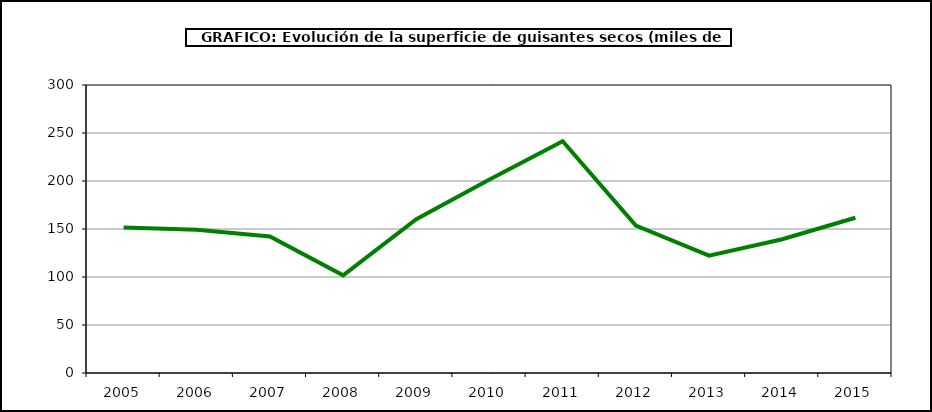
| Category | Superficie |
|---|---|
| 2005.0 | 151.54 |
| 2006.0 | 149.251 |
| 2007.0 | 142.199 |
| 2008.0 | 101.745 |
| 2009.0 | 160.173 |
| 2010.0 | 201.458 |
| 2011.0 | 241.347 |
| 2012.0 | 153.482 |
| 2013.0 | 122.246 |
| 2014.0 | 139.386 |
| 2015.0 | 161.746 |